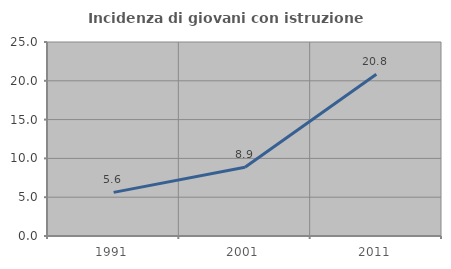
| Category | Incidenza di giovani con istruzione universitaria |
|---|---|
| 1991.0 | 5.625 |
| 2001.0 | 8.865 |
| 2011.0 | 20.833 |